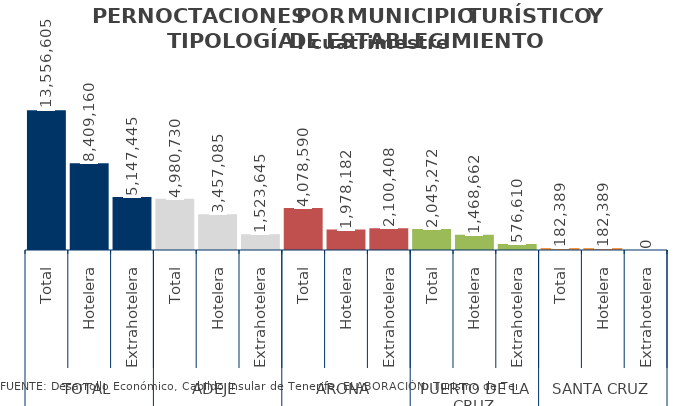
| Category | I cuatrimestre 2014 |
|---|---|
| 0 | 13556605 |
| 1 | 8409160 |
| 2 | 5147445 |
| 3 | 4980730 |
| 4 | 3457085 |
| 5 | 1523645 |
| 6 | 4078590 |
| 7 | 1978182 |
| 8 | 2100408 |
| 9 | 2045272 |
| 10 | 1468662 |
| 11 | 576610 |
| 12 | 182389 |
| 13 | 182389 |
| 14 | 0 |